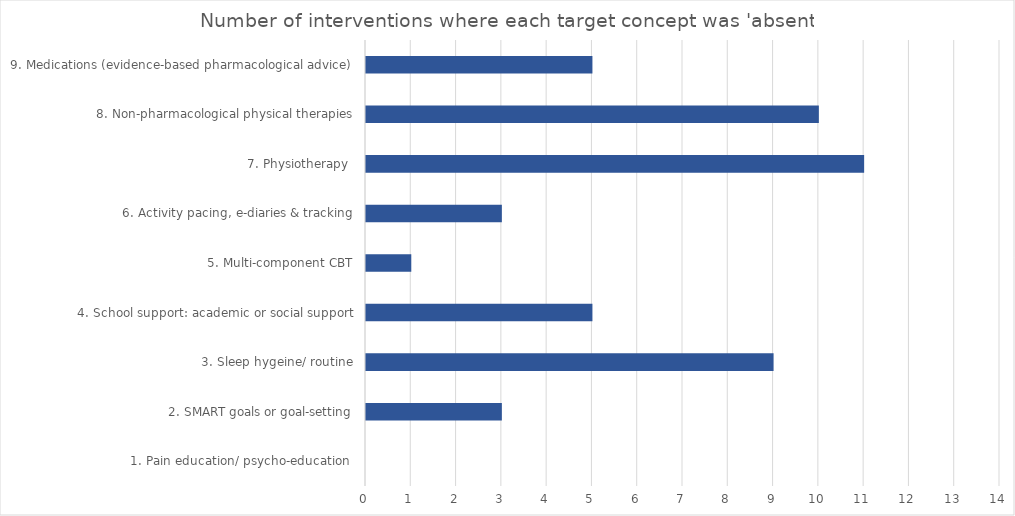
| Category | Series 0 |
|---|---|
| 1. Pain education/ psycho-education  | 0 |
| 2. SMART goals or goal-setting | 3 |
| 3. Sleep hygeine/ routine | 9 |
| 4. School support: academic or social support | 5 |
| 5. Multi-component CBT | 1 |
| 6. Activity pacing, e-diaries & tracking | 3 |
| 7. Physiotherapy  | 11 |
| 8. Non-pharmacological physical therapies | 10 |
| 9. Medications (evidence-based pharmacological advice) | 5 |